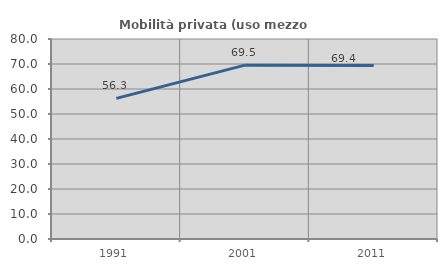
| Category | Mobilità privata (uso mezzo privato) |
|---|---|
| 1991.0 | 56.263 |
| 2001.0 | 69.534 |
| 2011.0 | 69.415 |